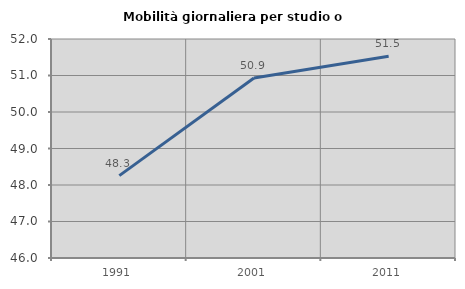
| Category | Mobilità giornaliera per studio o lavoro |
|---|---|
| 1991.0 | 48.258 |
| 2001.0 | 50.933 |
| 2011.0 | 51.528 |